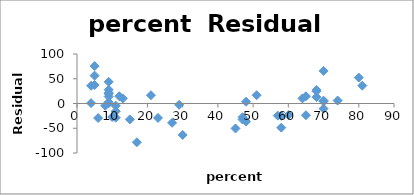
| Category | Series 0 |
|---|---|
| 8.0 | -4.577 |
| 47.0 | -27.854 |
| 27.0 | -39.03 |
| 6.0 | -29.316 |
| 45.0 | -50.425 |
| 29.0 | -2.697 |
| 81.0 | 36.056 |
| 68.0 | 12.85 |
| 48.0 | -36.578 |
| 65.0 | -23.692 |
| 57.0 | -24.499 |
| 15.0 | -32.159 |
| 13.0 | 10.247 |
| 58.0 | -24.942 |
| 5.0 | 56.287 |
| 9.0 | 21.553 |
| 11.0 | -28.668 |
| 9.0 | 0.412 |
| 68.0 | 27.339 |
| 64.0 | 10.279 |
| 80.0 | 52.446 |
| 11.0 | -15.682 |
| 9.0 | 43.727 |
| 4.0 | 0.74 |
| 9.0 | 14.103 |
| 21.0 | 16.689 |
| 9.0 | 19.686 |
| 30.0 | -63.496 |
| 70.0 | 65.905 |
| 70.0 | 4.12 |
| 11.0 | -4.461 |
| 74.0 | 5.91 |
| 60.0 | -23.32 |
| 5.0 | 75.59 |
| 23.0 | -29.233 |
| 9.0 | 2.682 |
| 51.0 | 16.748 |
| 70.0 | -10.441 |
| 70.0 | 5.803 |
| 58.0 | -48.756 |
| 5.0 | 37.316 |
| 12.0 | 14.631 |
| 47.0 | -32.38 |
| 4.0 | 35.804 |
| 68.0 | 24.852 |
| 65.0 | 14.61 |
| 48.0 | 3.654 |
| 17.0 | -78.313 |
| 9.0 | 27.807 |
| 10.0 | -27.327 |